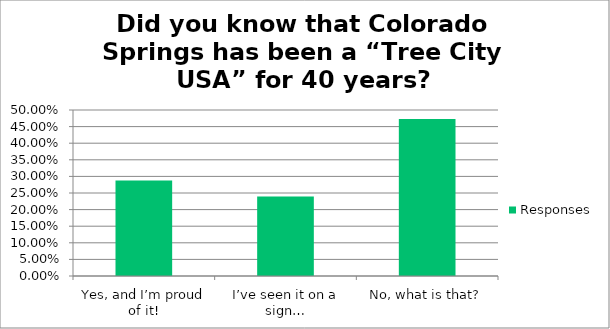
| Category | Responses |
|---|---|
| Yes, and I’m proud of it! | 0.288 |
| I’ve seen it on a sign… | 0.239 |
| No, what is that? | 0.473 |